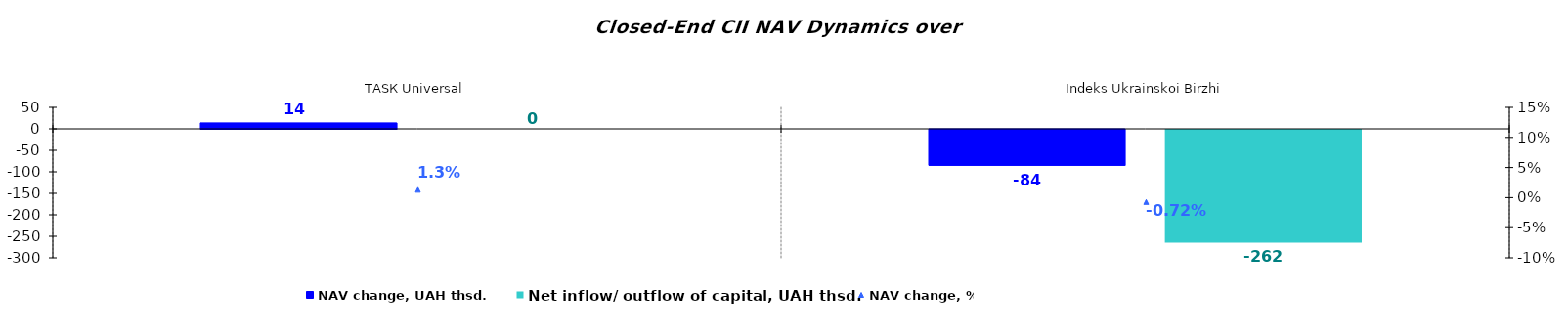
| Category | NAV change, UAH thsd. | Net inflow/ outflow of capital, UAH thsd. |
|---|---|---|
| ТАSК Universal | 13.909 | 0 |
| Іndeks Ukrainskoi Birzhi | -83.798 | -262.3 |